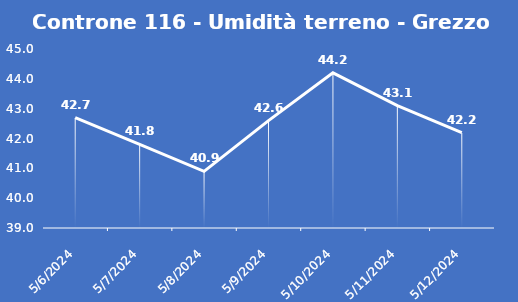
| Category | Controne 116 - Umidità terreno - Grezzo (%VWC) |
|---|---|
| 5/6/24 | 42.7 |
| 5/7/24 | 41.8 |
| 5/8/24 | 40.9 |
| 5/9/24 | 42.6 |
| 5/10/24 | 44.2 |
| 5/11/24 | 43.1 |
| 5/12/24 | 42.2 |